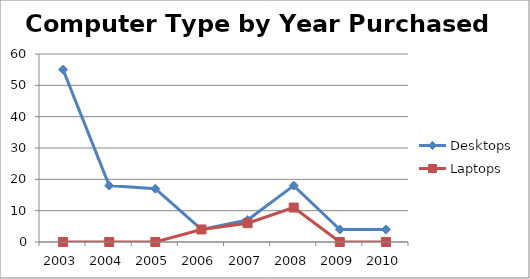
| Category | Desktops | Laptops |
|---|---|---|
| 2003.0 | 55 | 0 |
| 2004.0 | 18 | 0 |
| 2005.0 | 17 | 0 |
| 2006.0 | 4 | 4 |
| 2007.0 | 7 | 6 |
| 2008.0 | 18 | 11 |
| 2009.0 | 4 | 0 |
| 2010.0 | 4 | 0 |